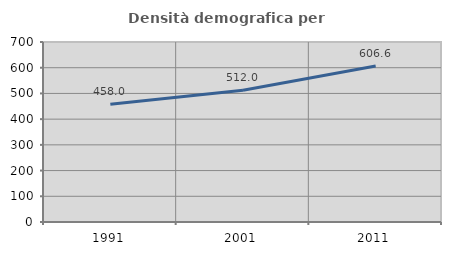
| Category | Densità demografica |
|---|---|
| 1991.0 | 458.041 |
| 2001.0 | 511.986 |
| 2011.0 | 606.59 |